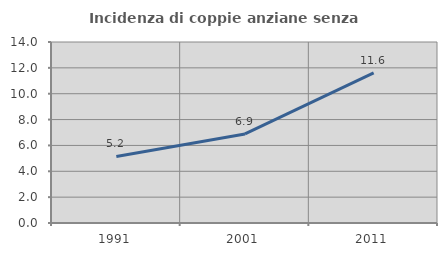
| Category | Incidenza di coppie anziane senza figli  |
|---|---|
| 1991.0 | 5.15 |
| 2001.0 | 6.887 |
| 2011.0 | 11.615 |